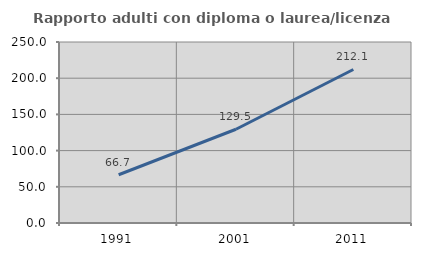
| Category | Rapporto adulti con diploma o laurea/licenza media  |
|---|---|
| 1991.0 | 66.667 |
| 2001.0 | 129.508 |
| 2011.0 | 212.069 |